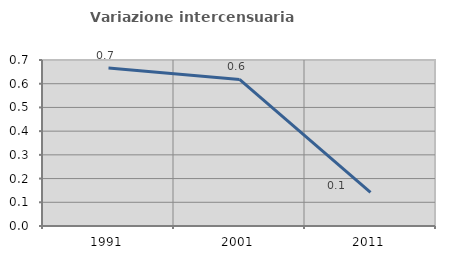
| Category | Variazione intercensuaria annua |
|---|---|
| 1991.0 | 0.667 |
| 2001.0 | 0.618 |
| 2011.0 | 0.142 |